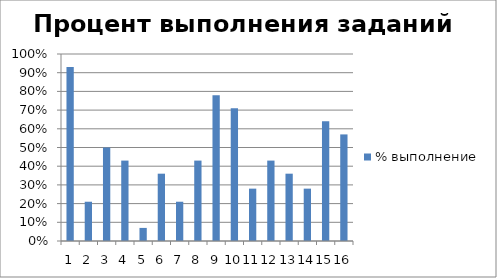
| Category | % выполнение |
|---|---|
| 0 | 0.93 |
| 1 | 0.21 |
| 2 | 0.5 |
| 3 | 0.43 |
| 4 | 0.07 |
| 5 | 0.36 |
| 6 | 0.21 |
| 7 | 0.43 |
| 8 | 0.78 |
| 9 | 0.71 |
| 10 | 0.28 |
| 11 | 0.43 |
| 12 | 0.36 |
| 13 | 0.28 |
| 14 | 0.64 |
| 15 | 0.57 |